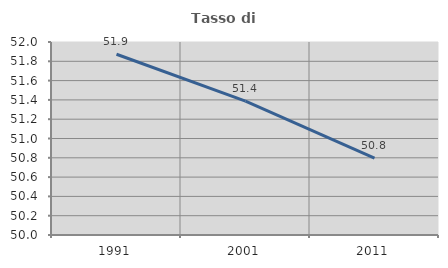
| Category | Tasso di occupazione   |
|---|---|
| 1991.0 | 51.873 |
| 2001.0 | 51.387 |
| 2011.0 | 50.798 |